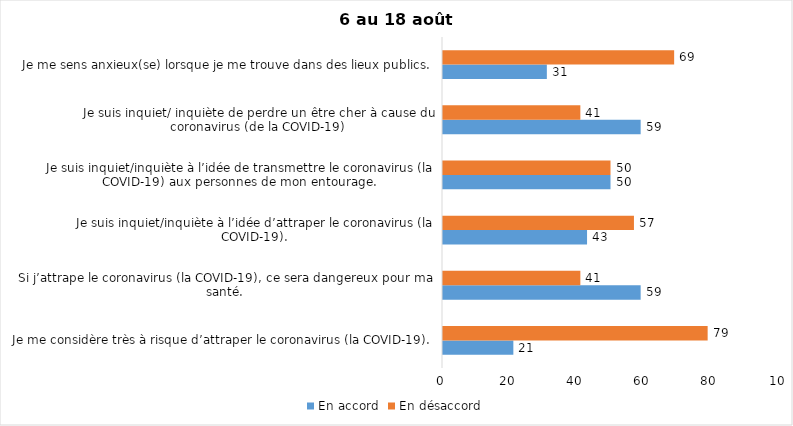
| Category | En accord | En désaccord |
|---|---|---|
| Je me considère très à risque d’attraper le coronavirus (la COVID-19). | 21 | 79 |
| Si j’attrape le coronavirus (la COVID-19), ce sera dangereux pour ma santé. | 59 | 41 |
| Je suis inquiet/inquiète à l’idée d’attraper le coronavirus (la COVID-19). | 43 | 57 |
| Je suis inquiet/inquiète à l’idée de transmettre le coronavirus (la COVID-19) aux personnes de mon entourage. | 50 | 50 |
| Je suis inquiet/ inquiète de perdre un être cher à cause du coronavirus (de la COVID-19) | 59 | 41 |
| Je me sens anxieux(se) lorsque je me trouve dans des lieux publics. | 31 | 69 |